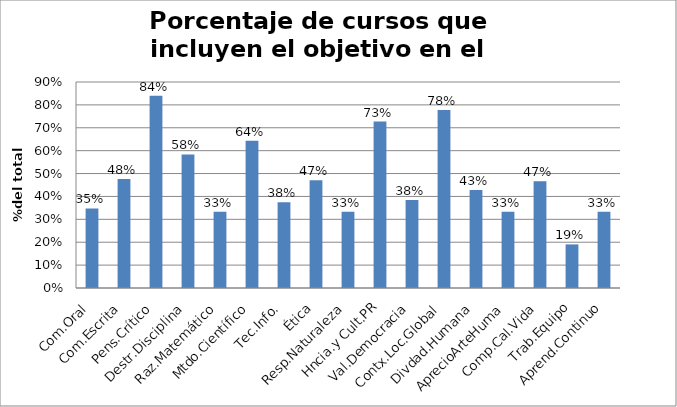
| Category | Series 0 |
|---|---|
| Com.Oral | 0.348 |
| Com.Escrita | 0.476 |
| Pens.Crítico | 0.84 |
| Destr.Disciplina | 0.583 |
| Raz.Matemático | 0.333 |
| Mtdo.Científico | 0.643 |
| Tec.Info. | 0.375 |
| Ética | 0.471 |
| Resp.Naturaleza | 0.333 |
| Hncia.y Cult.PR | 0.727 |
| Val.Democracia | 0.385 |
| Contx.Loc.Global | 0.778 |
| Divdad.Humana | 0.429 |
| AprecioArteHuma | 0.333 |
| Comp.Cal.Vida | 0.467 |
| Trab.Equipo | 0.19 |
| Aprend.Continuo | 0.333 |